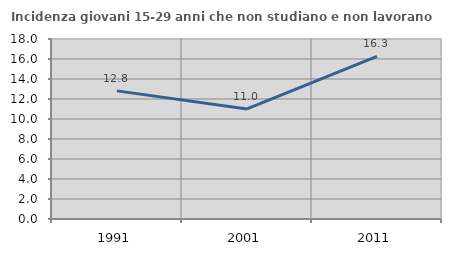
| Category | Incidenza giovani 15-29 anni che non studiano e non lavorano  |
|---|---|
| 1991.0 | 12.811 |
| 2001.0 | 11.006 |
| 2011.0 | 16.269 |